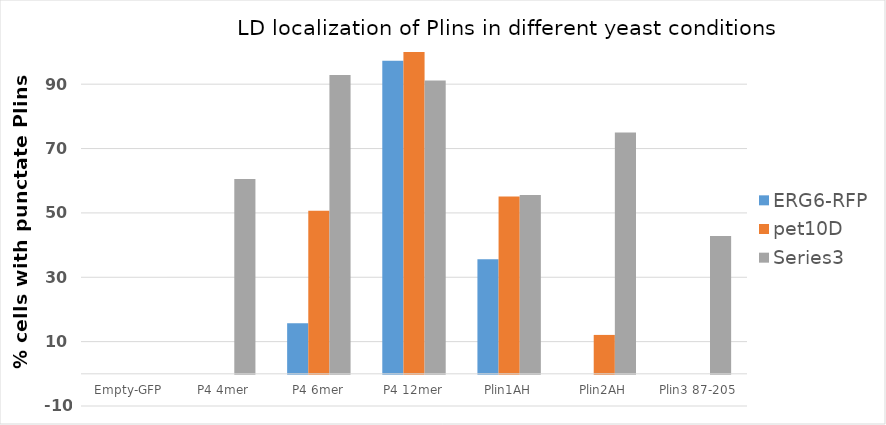
| Category | ERG6-RFP | pet10D | Series 2 |
|---|---|---|---|
| Empty-GFP | 0 | 0 | 0 |
| P4 4mer | 0 | 0 | 60.526 |
| P4 6mer | 15.714 | 50.704 | 92.857 |
| P4 12mer | 97.26 | 100 | 91.176 |
| Plin1AH | 35.593 | 55.085 | 55.556 |
| Plin2AH | 0 | 12.088 | 75 |
| Plin3 87-205 | 0 | 0 | 42.857 |